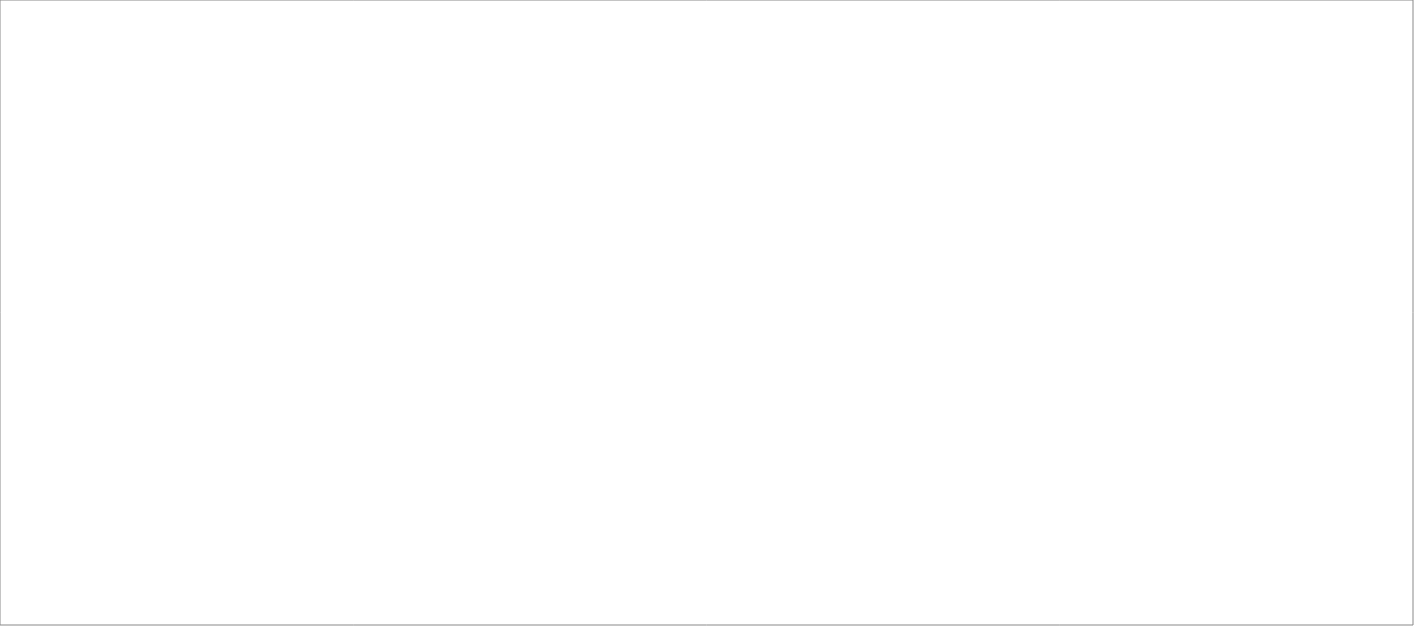
| Category | Total |
|---|---|
| Poolia Sverige AB | 85 |
| Randstad AB | 80 |
| Tarasso AB | 65 |
| Experis AB | 45 |
| Source Executive Recruitment Sweden AB | 25 |